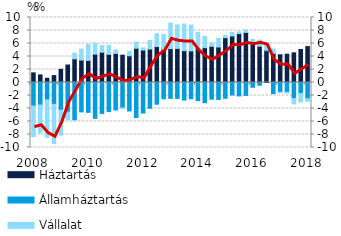
| Category | Háztartás | Államháztartás | Vállalat |
|---|---|---|---|
| 2008.0 | 1.482 | -3.614 | -4.726 |
| 2008.0 | 1.167 | -3.465 | -4.286 |
| 2008.0 | 0.647 | -2.667 | -5.769 |
| 2008.0 | 1.06 | -3.365 | -6.035 |
| 2009.0 | 2.022 | -4.26 | -3.85 |
| 2009.0 | 2.69 | -4.568 | -1.185 |
| 2009.0 | 3.646 | -5.737 | 0.861 |
| 2009.0 | 3.452 | -4.523 | 1.684 |
| 2010.0 | 3.403 | -4.596 | 2.463 |
| 2010.0 | 4.357 | -5.515 | 1.688 |
| 2010.0 | 4.662 | -4.769 | 1.012 |
| 2010.0 | 4.334 | -4.478 | 1.381 |
| 2011.0 | 4.471 | -4.232 | 0.537 |
| 2011.0 | 4.204 | -3.914 | -0.111 |
| 2011.0 | 4.109 | -4.378 | 0.654 |
| 2011.0 | 5.273 | -5.386 | 0.951 |
| 2012.0 | 4.99 | -4.694 | 0.332 |
| 2012.0 | 5.147 | -3.959 | 1.313 |
| 2012.0 | 5.529 | -3.339 | 1.965 |
| 2012.0 | 5.095 | -2.511 | 2.283 |
| 2013.0 | 5.217 | -2.438 | 3.935 |
| 2013.0 | 5.243 | -2.452 | 3.629 |
| 2013.0 | 4.902 | -2.704 | 4.105 |
| 2013.0 | 4.863 | -2.499 | 3.957 |
| 2014.0 | 5.255 | -2.784 | 2.466 |
| 2014.0 | 5.362 | -3.109 | 1.739 |
| 2014.0 | 5.569 | -2.575 | 0.494 |
| 2014.0 | 5.462 | -2.602 | 1.299 |
| 2015.0 | 6.893 | -2.428 | 0.355 |
| 2015.0 | 7.166 | -1.927 | 0.557 |
| 2015.0 | 7.531 | -2.068 | 0.277 |
| 2015.0 | 7.706 | -1.99 | 0.375 |
| 2016.0 | 5.925 | -0.73 | 0.696 |
| 2016.0 | 5.579 | -0.424 | 0.949 |
| 2016.0 | 4.874 | 0.125 | 0.814 |
| 2016.0 | 4.481 | -1.706 | 0.658 |
| 2017.0 | 4.266 | -1.493 | -0.041 |
| 2017.0 | 4.358 | -1.502 | -0.109 |
| 2017.0 | 4.558 | -2.48 | -0.819 |
| 2017.0 | 5.083 | -1.691 | -1.312 |
| 2018.0 | 5.52 | -2.488 | -0.413 |